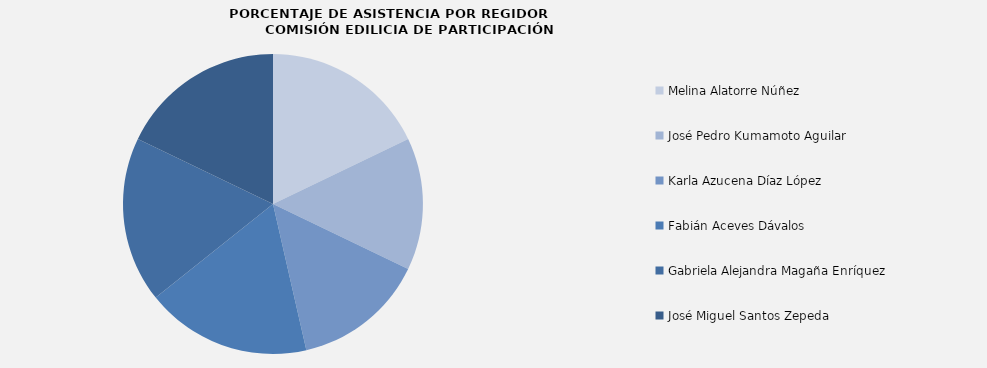
| Category | Series 0 |
|---|---|
| Melina Alatorre Núñez | 100 |
| José Pedro Kumamoto Aguilar | 80 |
| Karla Azucena Díaz López | 80 |
| Fabián Aceves Dávalos | 100 |
| Gabriela Alejandra Magaña Enríquez | 100 |
| José Miguel Santos Zepeda | 100 |